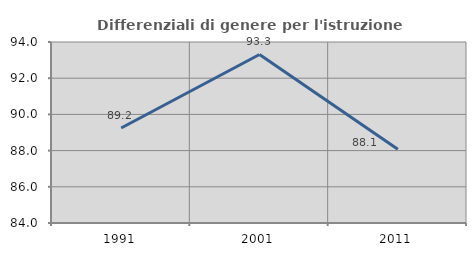
| Category | Differenziali di genere per l'istruzione superiore |
|---|---|
| 1991.0 | 89.247 |
| 2001.0 | 93.312 |
| 2011.0 | 88.07 |